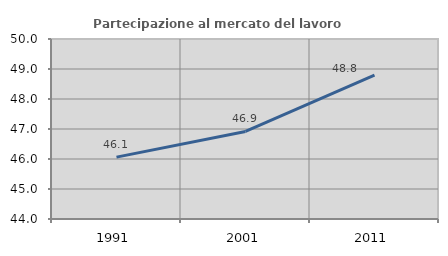
| Category | Partecipazione al mercato del lavoro  femminile |
|---|---|
| 1991.0 | 46.063 |
| 2001.0 | 46.92 |
| 2011.0 | 48.793 |